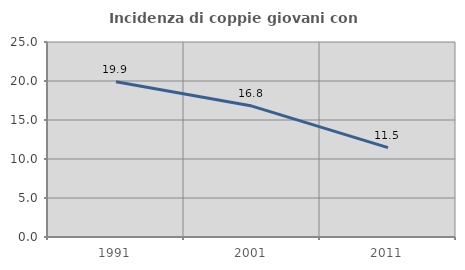
| Category | Incidenza di coppie giovani con figli |
|---|---|
| 1991.0 | 19.902 |
| 2001.0 | 16.783 |
| 2011.0 | 11.463 |